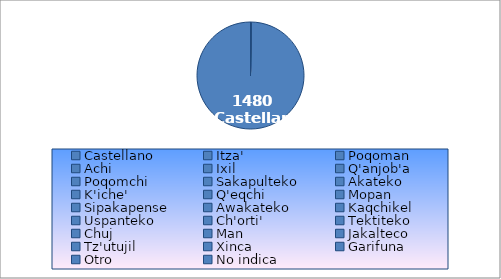
| Category | Series 0 |
|---|---|
| Castellano | 1480 |
| Itza' | 0 |
| Poqoman | 0 |
| Achi | 0 |
| Ixil | 0 |
| Q'anjob'a | 0 |
| Poqomchi | 0 |
| Sakapulteko | 0 |
| Akateko | 0 |
| K'iche' | 0 |
| Q'eqchi | 0 |
| Mopan | 0 |
| Sipakapense | 0 |
| Awakateko | 0 |
| Kaqchikel | 0 |
| Uspanteko | 0 |
| Ch'orti' | 0 |
| Tektiteko | 0 |
| Chuj | 0 |
| Man | 0 |
| Jakalteco | 0 |
| Tz'utujil | 0 |
| Xinca | 0 |
| Garifuna | 0 |
| Otro | 0 |
| No indica | 0 |